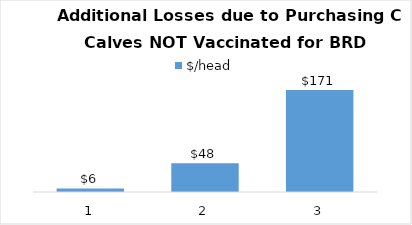
| Category | $/head |
|---|---|
| 0 | 5.894 |
| 1 | 48.413 |
| 2 | 171.413 |